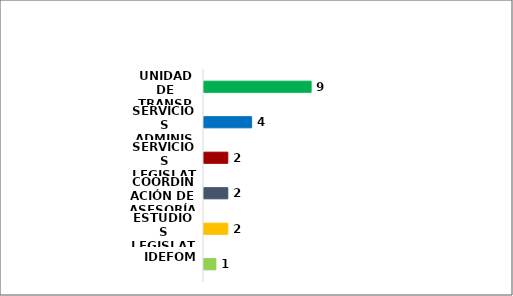
| Category | Series 0 |
|---|---|
| IDEFOM | 1 |
| ESTUDIOS LEGISLATIVOS | 2 |
| COORDINACIÓN DE ASESORÍA | 2 |
| SERVICIOS LEGISLATIVOS | 2 |
| SERVICIOS ADMINISTRATIVOS | 4 |
| UNIDAD DE TRANSPARENCIA | 9 |